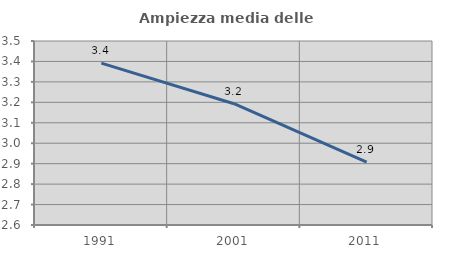
| Category | Ampiezza media delle famiglie |
|---|---|
| 1991.0 | 3.392 |
| 2001.0 | 3.193 |
| 2011.0 | 2.908 |